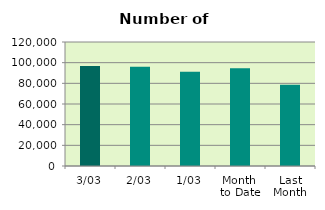
| Category | Series 0 |
|---|---|
| 3/03 | 96776 |
| 2/03 | 96038 |
| 1/03 | 91180 |
| Month 
to Date | 94664.667 |
| Last
Month | 78748.7 |